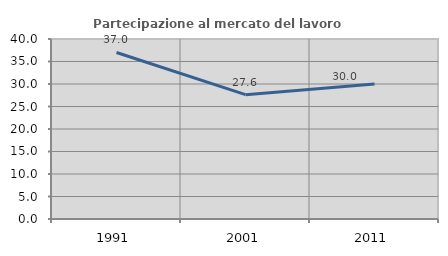
| Category | Partecipazione al mercato del lavoro  femminile |
|---|---|
| 1991.0 | 37.006 |
| 2001.0 | 27.632 |
| 2011.0 | 30.01 |